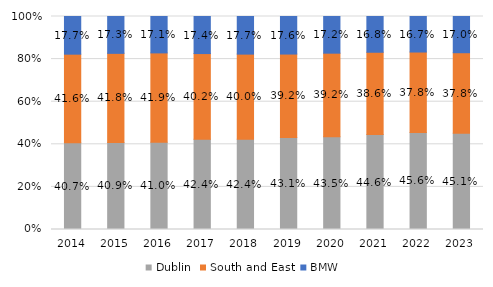
| Category | Dublin | South and East | BMW  |
|---|---|---|---|
| 2014.0 | 0.407 | 0.416 | 0.177 |
| 2015.0 | 0.409 | 0.418 | 0.173 |
| 2016.0 | 0.41 | 0.419 | 0.171 |
| 2017.0 | 0.424 | 0.402 | 0.174 |
| 2018.0 | 0.424 | 0.4 | 0.177 |
| 2019.0 | 0.431 | 0.392 | 0.176 |
| 2020.0 | 0.435 | 0.392 | 0.172 |
| 2021.0 | 0.446 | 0.386 | 0.168 |
| 2022.0 | 0.456 | 0.378 | 0.167 |
| 2023.0 | 0.451 | 0.378 | 0.17 |